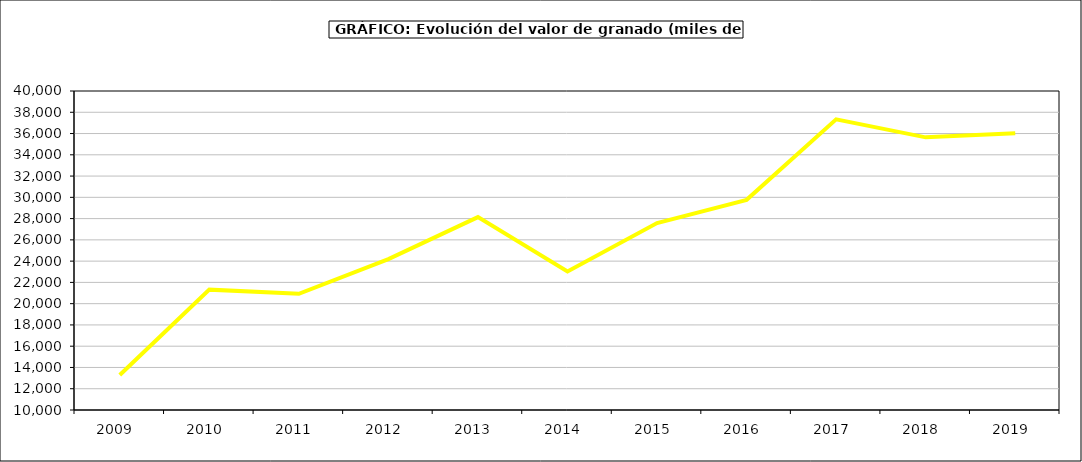
| Category | valor granado |
|---|---|
| 2009.0 | 13295.125 |
| 2010.0 | 21318.764 |
| 2011.0 | 20923.27 |
| 2012.0 | 24185.236 |
| 2013.0 | 28138.938 |
| 2014.0 | 23031.365 |
| 2015.0 | 27581 |
| 2016.0 | 29763 |
| 2017.0 | 37333.028 |
| 2018.0 | 35641.983 |
| 2019.0 | 36035.866 |